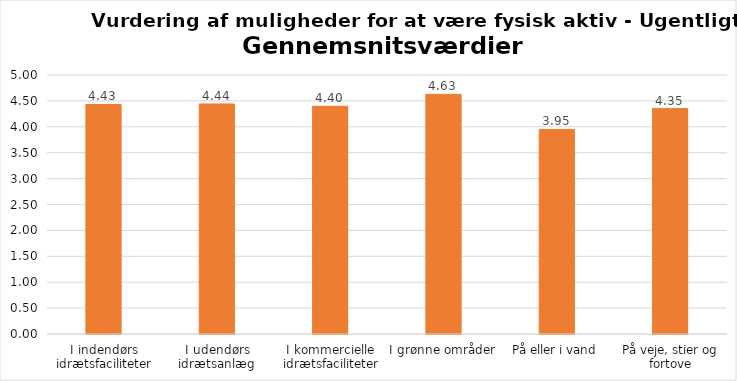
| Category | Gennemsnit |
|---|---|
| I indendørs idrætsfaciliteter | 4.431 |
| I udendørs idrætsanlæg | 4.441 |
| I kommercielle idrætsfaciliteter | 4.396 |
| I grønne områder | 4.626 |
| På eller i vand | 3.949 |
| På veje, stier og fortove | 4.351 |